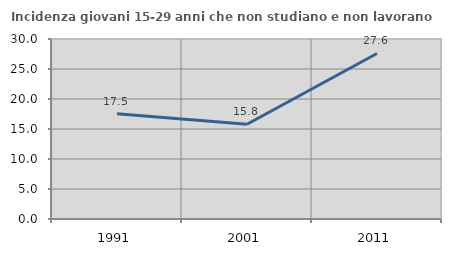
| Category | Incidenza giovani 15-29 anni che non studiano e non lavorano  |
|---|---|
| 1991.0 | 17.526 |
| 2001.0 | 15.789 |
| 2011.0 | 27.586 |